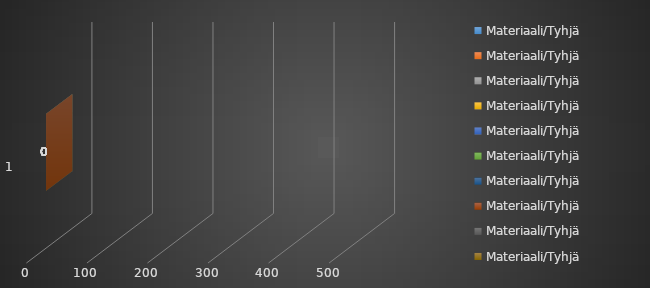
| Category | Materiaali/Tyhjä |
|---|---|
| 0 | 0 |